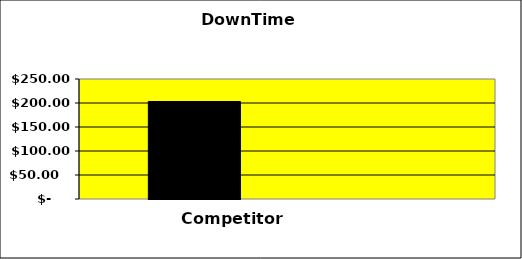
| Category | Series 0 | Series 1 | Series 2 |
|---|---|---|---|
| 0 | 203.125 |  | 0 |